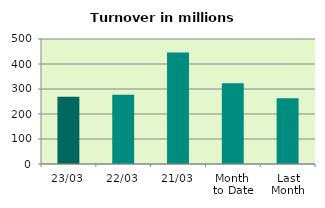
| Category | Series 0 |
|---|---|
| 23/03 | 268.999 |
| 22/03 | 276.686 |
| 21/03 | 445.818 |
| Month 
to Date | 322.59 |
| Last
Month | 263.32 |